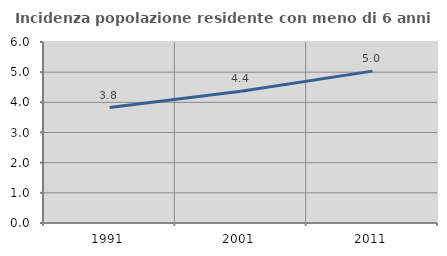
| Category | Incidenza popolazione residente con meno di 6 anni |
|---|---|
| 1991.0 | 3.828 |
| 2001.0 | 4.364 |
| 2011.0 | 5.034 |